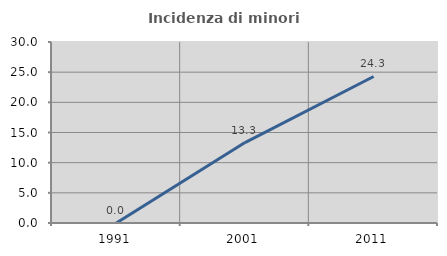
| Category | Incidenza di minori stranieri |
|---|---|
| 1991.0 | 0 |
| 2001.0 | 13.333 |
| 2011.0 | 24.286 |